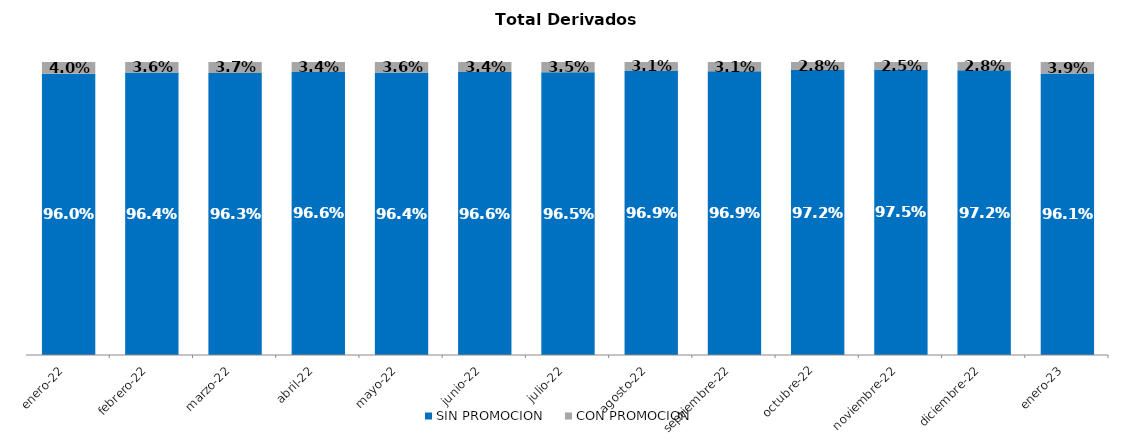
| Category | SIN PROMOCION   | CON PROMOCION   |
|---|---|---|
| 2022-01-01 | 0.96 | 0.04 |
| 2022-02-01 | 0.964 | 0.036 |
| 2022-03-01 | 0.963 | 0.037 |
| 2022-04-01 | 0.966 | 0.034 |
| 2022-05-01 | 0.964 | 0.036 |
| 2022-06-01 | 0.966 | 0.034 |
| 2022-07-01 | 0.965 | 0.035 |
| 2022-08-01 | 0.969 | 0.031 |
| 2022-09-01 | 0.969 | 0.031 |
| 2022-10-01 | 0.972 | 0.028 |
| 2022-11-01 | 0.975 | 0.025 |
| 2022-12-01 | 0.972 | 0.028 |
| 2023-01-01 | 0.961 | 0.039 |